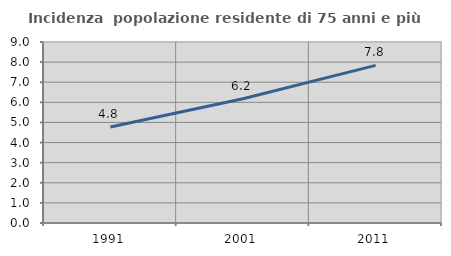
| Category | Incidenza  popolazione residente di 75 anni e più |
|---|---|
| 1991.0 | 4.775 |
| 2001.0 | 6.175 |
| 2011.0 | 7.837 |